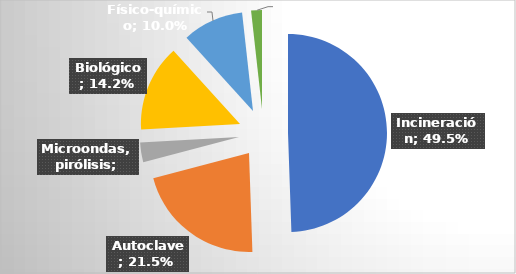
| Category | Series 0 |
|---|---|
| Incineración | 1842218.8 |
|  Autoclave | 799099.89 |
| Microondas, pirólisis | 119801.41 |
|  Biológico | 527634.5 |
| Físico-químico | 370826.25 |
| Otros | 65723.2 |